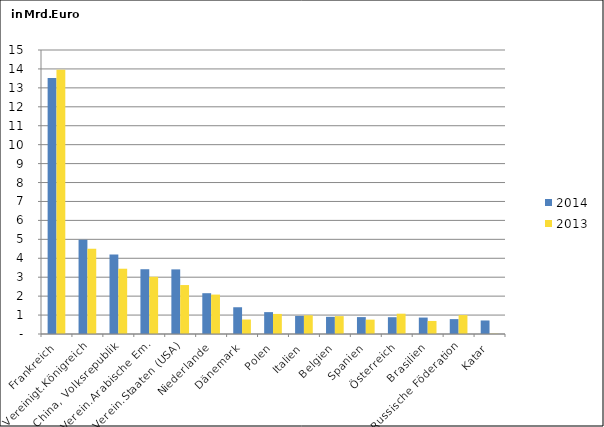
| Category | 2014 | 2013 |
|---|---|---|
| Frankreich | 13.519 | 13.959 |
| Vereinigt.Königreich | 4.978 | 4.499 |
| China, Volksrepublik | 4.199 | 3.447 |
| Verein.Arabische Em. | 3.421 | 3.022 |
| Verein.Staaten (USA) | 3.413 | 2.586 |
| Niederlande | 2.155 | 2.082 |
| Dänemark | 1.413 | 0.765 |
| Polen | 1.155 | 1.059 |
| Italien | 0.954 | 0.989 |
| Belgien | 0.907 | 0.944 |
| Spanien | 0.893 | 0.758 |
| Österreich | 0.887 | 1.073 |
| Brasilien | 0.868 | 0.689 |
| Russische Föderation | 0.786 | 1 |
| Katar | 0.714 | 0.013 |